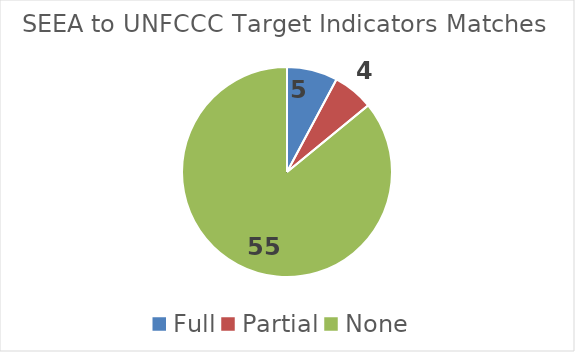
| Category | Series 0 |
|---|---|
| Full | 5 |
| Partial | 4 |
| None | 55 |